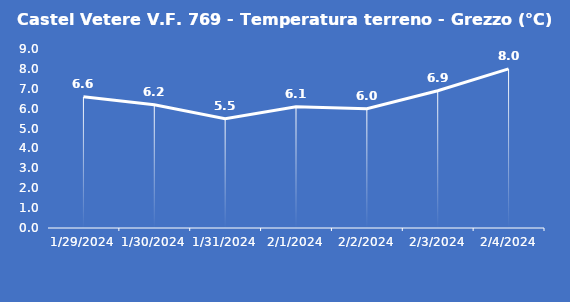
| Category | Castel Vetere V.F. 769 - Temperatura terreno - Grezzo (°C) |
|---|---|
| 1/29/24 | 6.6 |
| 1/30/24 | 6.2 |
| 1/31/24 | 5.5 |
| 2/1/24 | 6.1 |
| 2/2/24 | 6 |
| 2/3/24 | 6.9 |
| 2/4/24 | 8 |